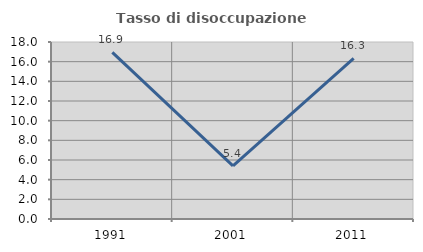
| Category | Tasso di disoccupazione giovanile  |
|---|---|
| 1991.0 | 16.935 |
| 2001.0 | 5.405 |
| 2011.0 | 16.327 |